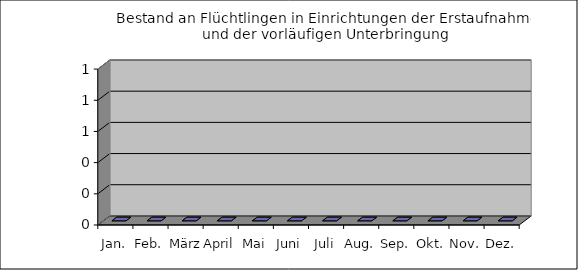
| Category | Bestand Flüchtlinge in staatlichen Unterkünften |
|---|---|
| Jan. | 0 |
| Feb. | 0 |
| März | 0 |
| April | 0 |
| Mai | 0 |
| Juni | 0 |
| Juli | 0 |
| Aug. | 0 |
| Sep. | 0 |
| Okt. | 0 |
| Nov. | 0 |
| Dez. | 0 |